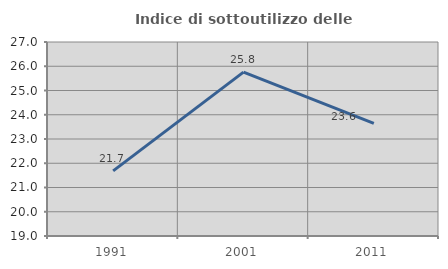
| Category | Indice di sottoutilizzo delle abitazioni  |
|---|---|
| 1991.0 | 21.687 |
| 2001.0 | 25.758 |
| 2011.0 | 23.645 |